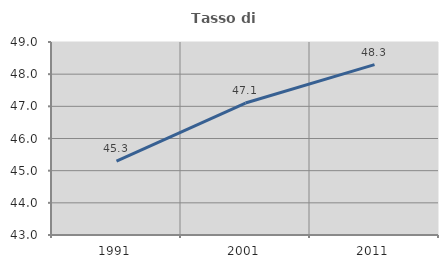
| Category | Tasso di occupazione   |
|---|---|
| 1991.0 | 45.3 |
| 2001.0 | 47.103 |
| 2011.0 | 48.298 |